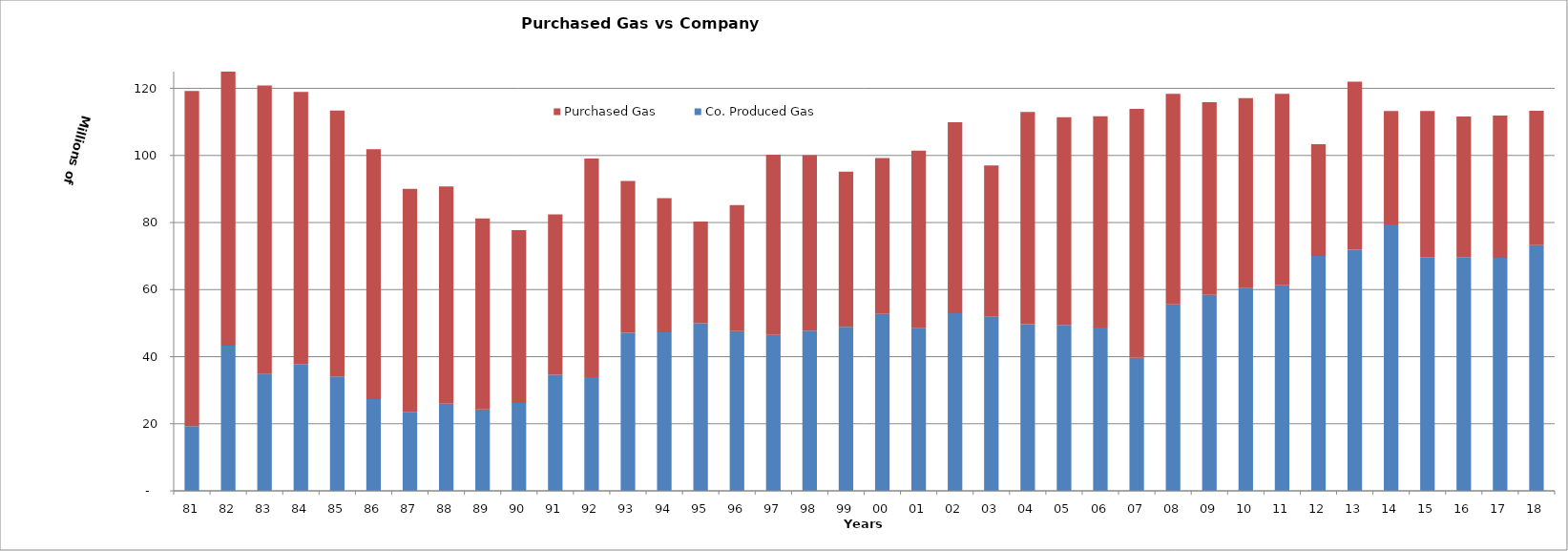
| Category | Co. Produced Gas | Purchased Gas |
|---|---|---|
| 81 | 19314840 | 99923224.286 |
| 82 | 43246998.15 | 83355155.932 |
| 83 | 34826991 | 86058364.102 |
| 84 | 37820993.55 | 81135632.3 |
| 85 | 34069999.65 | 79338914.22 |
| 86 | 27368998.35 | 74494419 |
| 87 | 23591997.15 | 66421173 |
| 88 | 26008993.35 | 64729329 |
| 89 | 24293001.45 | 56923090 |
| 90 | 26213995.2 | 51484195 |
| 91 | 34580997.3 | 47885156 |
| 92 | 33882996.3 | 65203726.94 |
| 93 | 47120999.55 | 45285386 |
| 94 | 47276415 | 39990856 |
| 95 | 49990035 | 30336637 |
| 96 | 47625735 | 37575715 |
| 97 | 46503000 | 53734600 |
| 98 | 47764000 | 52313902 |
| 99 | 48895000 | 46249773 |
| 00 | 52781000 | 46425578 |
| 01 | 48475000 | 52979036 |
| 02 | 52970000 | 56912695 |
| 03 | 51885000 | 45115003 |
| 04 | 49694000 | 63287064 |
| 05 | 49481000 | 61950995 |
| 06 | 48701000 | 63003039 |
| 07 | 39670000 | 74222918 |
| 08 | 55576000 | 62828533 |
| 09 | 58432000 | 57448633 |
| 10 | 60422000 | 56643058 |
| 11 | 61306000 | 57100064 |
| 12 | 70015000 | 33372542 |
| 13 | 71916000 | 50085436 |
| 14 | 79417359.135 | 33847946.987 |
| 15 | 69703498 | 43561808.122 |
| 16 | 69670858 | 41964843 |
| 17 | 69476079.68 | 42407495.32 |
| 18 | 73276451.42 | 40022074.58 |